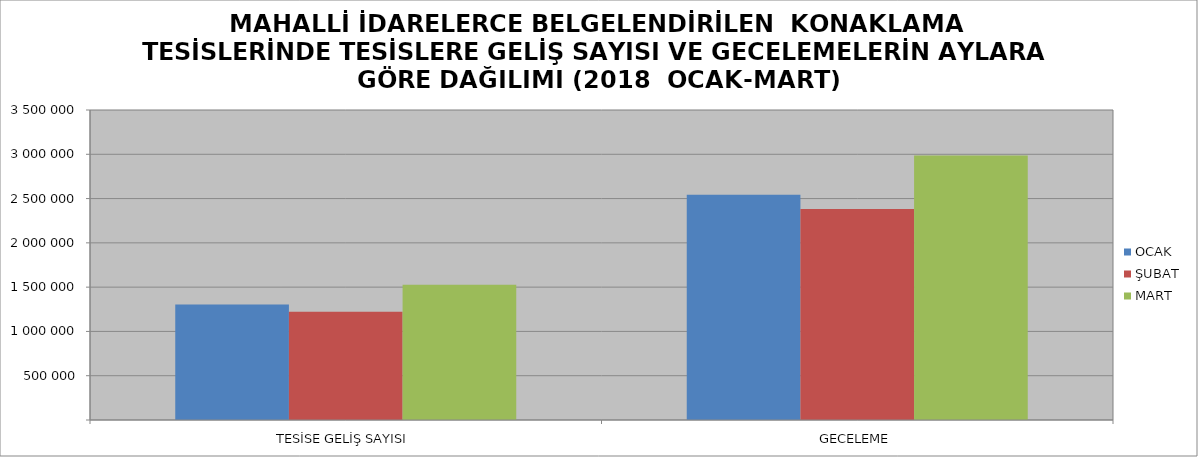
| Category | OCAK | ŞUBAT | MART |
|---|---|---|---|
| TESİSE GELİŞ SAYISI | 1303353 | 1223475 | 1526172 |
| GECELEME | 2542103 | 2381300 | 2986820 |